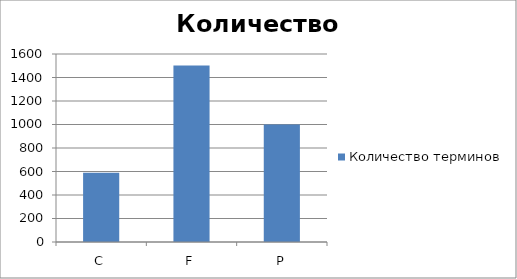
| Category | Количество терминов |
|---|---|
| C | 589 |
| F | 1503 |
| P | 1001 |